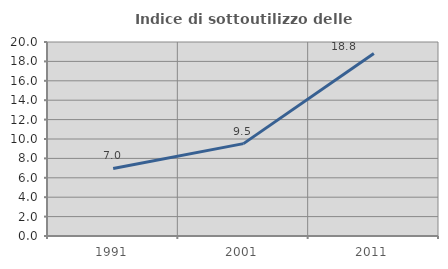
| Category | Indice di sottoutilizzo delle abitazioni  |
|---|---|
| 1991.0 | 6.967 |
| 2001.0 | 9.524 |
| 2011.0 | 18.812 |